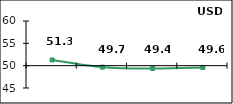
| Category | Диффузионный индекс* |
|---|---|
| 0 | 51.275 |
| 1 | 49.67 |
| 2 | 49.375 |
| 3 | 49.595 |